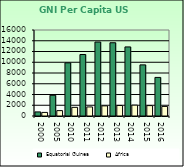
| Category | Equatorial Guinea | Africa                        |
|---|---|---|
| 2000.0 | 760 | 668.557 |
| 2005.0 | 3850 | 1002.896 |
| 2010.0 | 9890 | 1608.999 |
| 2011.0 | 11440 | 1686.521 |
| 2012.0 | 13760 | 1885.129 |
| 2013.0 | 13630 | 1956.671 |
| 2014.0 | 12850 | 2022.289 |
| 2015.0 | 9510 | 1932.283 |
| 2016.0 | 7180 | 1781.415 |